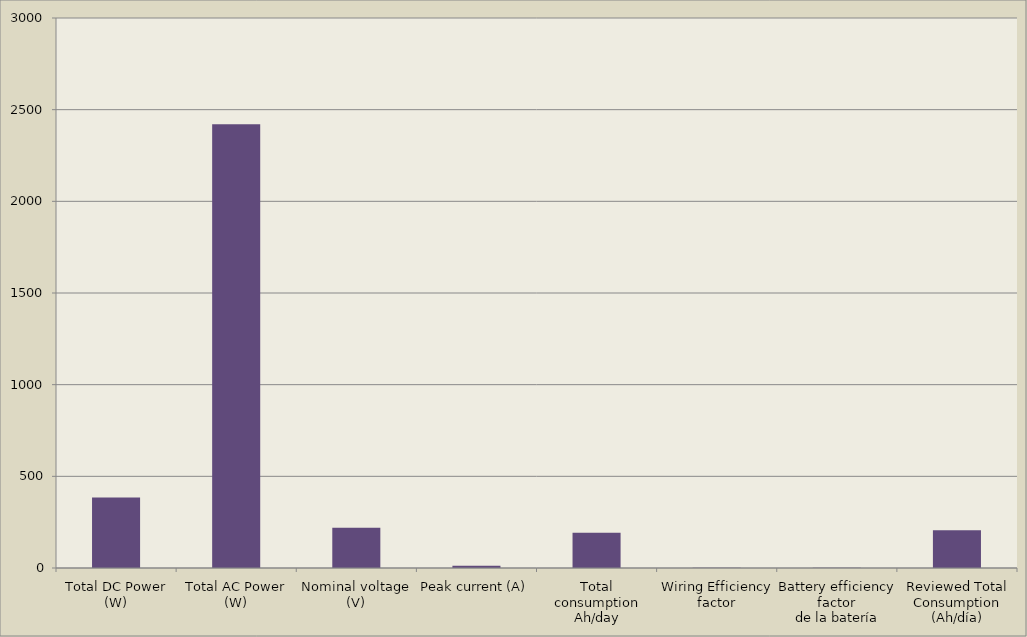
| Category | Series 0 |
|---|---|
| Total DC Power
(W) | 384 |
| Total AC Power
(W) | 2420 |
| Nominal voltage (V) | 220 |
| Peak current (A) | 12.745 |
| Total consumption
Ah/day | 192.067 |
| Wiring Efficiency factor | 0.98 |
| Battery efficiency factor
de la batería | 0.95 |
| Reviewed Total Consumption
(Ah/día) | 206.302 |